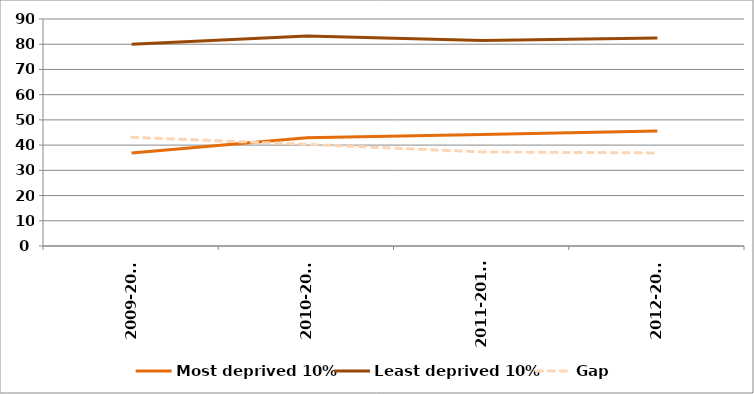
| Category | Most deprived 10% | Least deprived 10% | Gap |
|---|---|---|---|
| 2009-2010 | 36.9 | 80 | 43.1 |
| 2010-2011 | 42.9 | 83.3 | 40.3 |
| 2011-2012r | 44.2 | 81.5 | 37.3 |
| 2012-2013 | 45.6 | 82.5 | 36.9 |